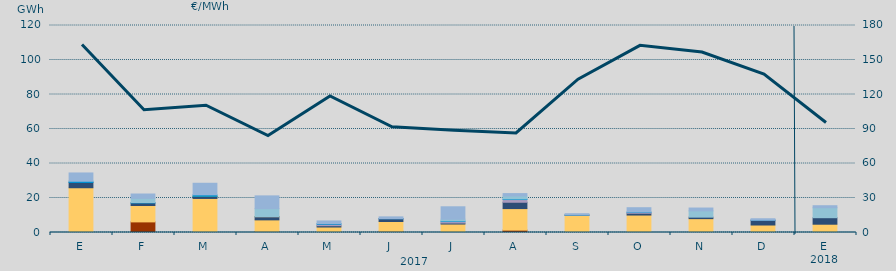
| Category | Carbón | Ciclo Combinado | Cogeneración | Consumo Bombeo | Enlace Península Baleares | Eólica | Hidráulica | Internacionales | Otras Renovables | Residuos no Renovables | Solar fotovoltaica | Turbinación bombeo |
|---|---|---|---|---|---|---|---|---|---|---|---|---|
| E | 0 | 25945.3 | 0 | 3031.3 | 0 | 0 | 733.3 | 0 | 0 | 0 | 0 | 4804 |
| F | 6150 | 9508.4 | 0 | 1469.4 | 0 | 0 | 198 | 2463.6 | 0 | 0 | 0 | 2519.7 |
| M | 0 | 19740.7 | 0 | 1177.9 | 20.4 | 43.7 | 849.6 | 0 | 0 | 0 | 0 | 6709.7 |
| A | 610 | 6714.7 | 0 | 1740 | 132.6 | 93.7 | 0 | 4549.7 | 0 | 0 | 0 | 7385.9 |
| M | 70 | 3116.9 | 0 | 762.7 | 846.6 | 0 | 410 | 0 | 0 | 0 | 0 | 1489.3 |
| J | 673.2 | 5702.5 | 0 | 1567.6 | 28.4 | 0 | 149.4 | 0 | 0 | 0 | 0 | 940.1 |
| J | 0 | 4906.7 | 0 | 593.2 | 844.1 | 0 | 376.7 | 973.2 | 0 | 0 | 0 | 7214.8 |
| A | 1372.5 | 12488.5 | 0 | 3675.7 | 1561.2 | 0 | 359.5 | 1700.4 | 0 | 0 | 0 | 1397.9 |
| S | 0 | 9962.3 | 0 | 123.8 | 0 | 0 | 40 | 0 | 0 | 0 | 0 | 759.3 |
| O | 0 | 10119.2 | 0 | 1038.2 | 495.2 | 0 | 208.4 | 0 | 0 | 0 | 0 | 2510.5 |
| N | 0 | 8034.3 | 0 | 863.8 | 0 | 0 | 0 | 3635.7 | 0 | 0 | 0 | 1650.6 |
| D | 374 | 3967.2 | 0 | 2746.1 | 58.6 | 0 | 52.1 | 0 | 0 | 0 | 0 | 774.9 |
| E | 0 | 4799.8 | 0 | 3776.1 | 0 | 0 | 0 | 5766.5 | 0 | 0 | 0 | 1181.9 |